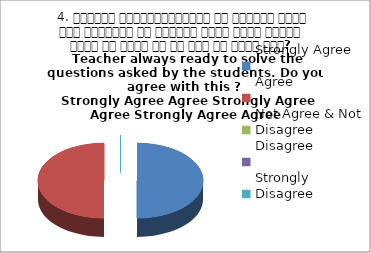
| Category | 4. शिक्षक विद्यार्थियों के द्वारा पूछे गये प्रश्नो का समाधान करने हेतु तत्पर  रहते है क्या आप इस बात से सहमत हैं? 
 Teacher always ready to solve the questions asked by the students. Do you agree with this ? 
 Strongly Agree Agree Strongly Agree Agree Str |
|---|---|
| Strongly Agree | 2 |
| Agree | 2 |
| Not Agree & Not Disagree | 0 |
| Disagree | 0 |
| Strongly Disagree | 0 |